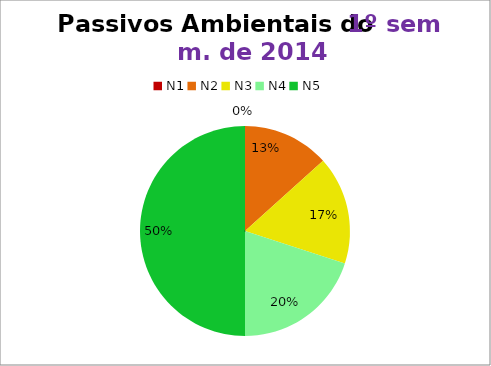
| Category | 1º/14 |
|---|---|
| N1 | 0 |
| N2 | 4 |
| N3 | 5 |
| N4 | 6 |
| N5 | 15 |